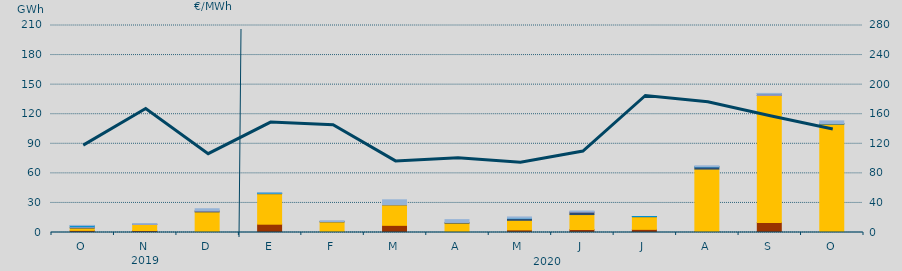
| Category | Carbón | Ciclo Combinado | Cogeneración | Consumo Bombeo | Enlace Península Baleares | Hidráulica | Turbinación bombeo |
|---|---|---|---|---|---|---|---|
| O | 2142 | 2403.7 | 0 | 557.8 | 729 | 1220 | 154.4 |
| N | 1990 | 6178.7 | 0 | 123 | 256 | 0 | 528.8 |
| D | 480 | 20442.6 | 0 | 860.7 | 364.9 | 0 | 1941.3 |
| E | 8420 | 30910.7 | 0 | 268 | 0 | 577.4 | 42.2 |
| F | 555 | 10252.6 | 0 | 288.2 | 0 | 0 | 841.9 |
| M | 7260 | 20800.5 | 0 | 100 | 224 | 0 | 4781.4 |
| A | 0 | 9541.3 | 0 | 636 | 60 | 0 | 2816.9 |
| M | 2649.6 | 9736.2 | 0 | 1745.1 | 0 | 334.1 | 1316.2 |
| J | 3060 | 15134.9 | 0 | 2490.7 | 411.1 | 0 | 685.4 |
| J | 3178 | 12853.9 | 0 | 133.1 | 0 | 91.7 | 0 |
| A | 1050 | 63281 | 0 | 2200 | 0 | 188.1 | 916.7 |
| S | 10238 | 128800.8 | 0 | 57.3 | 1627 | 176.6 | 209.8 |
| O | 0 | 110024.3 | 0 | 262 | 0 | 225.4 | 2701.6 |